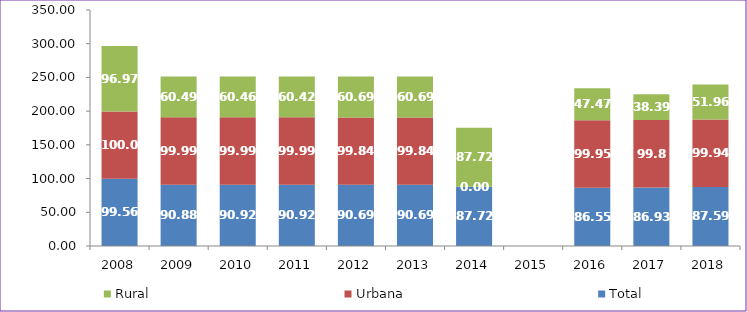
| Category | Total | Urbana | Rural |
|---|---|---|---|
| 2008.0 | 99.56 | 100 | 96.97 |
| 2009.0 | 90.88 | 99.99 | 60.49 |
| 2010.0 | 90.92 | 99.99 | 60.46 |
| 2011.0 | 90.92 | 99.99 | 60.42 |
| 2012.0 | 90.69 | 99.84 | 60.69 |
| 2013.0 | 90.69 | 99.84 | 60.69 |
| 2014.0 | 87.72 | 0 | 87.72 |
| 2015.0 | 0 | 0 | 0 |
| 2016.0 | 86.55 | 99.95 | 47.47 |
| 2017.0 | 86.93 | 99.8 | 38.39 |
| 2018.0 | 87.59 | 99.94 | 51.96 |